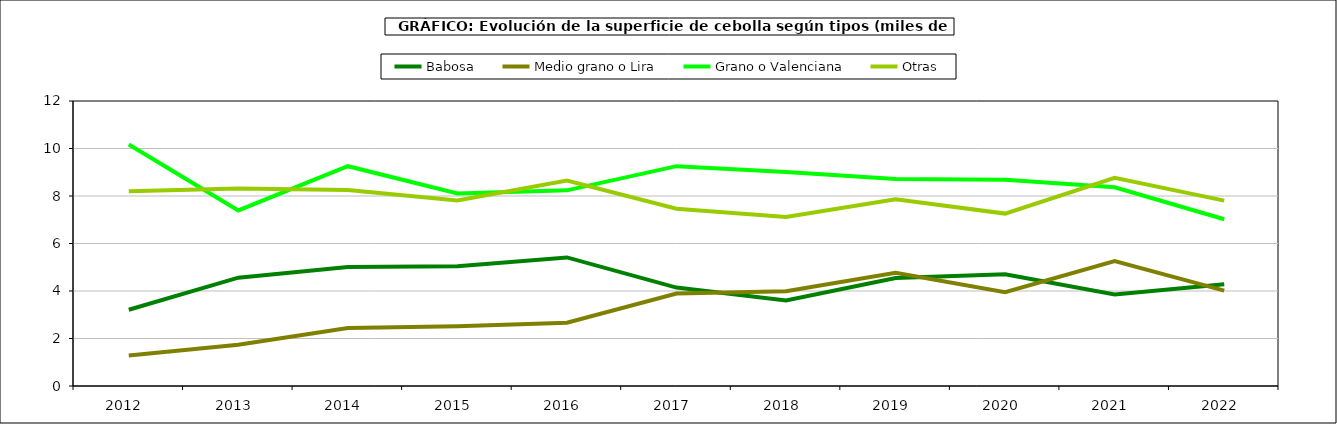
| Category | Babosa | Medio grano o Lira | Grano o Valenciana | Otras |
|---|---|---|---|---|
| 2012.0 | 3.212 | 1.284 | 10.171 | 8.2 |
| 2013.0 | 4.561 | 1.735 | 7.391 | 8.321 |
| 2014.0 | 5.014 | 2.441 | 9.254 | 8.252 |
| 2015.0 | 5.04 | 2.521 | 8.109 | 7.81 |
| 2016.0 | 5.414 | 2.662 | 8.238 | 8.655 |
| 2017.0 | 4.145 | 3.897 | 9.256 | 7.464 |
| 2018.0 | 3.6 | 3.987 | 9.012 | 7.113 |
| 2019.0 | 4.546 | 4.766 | 8.714 | 7.863 |
| 2020.0 | 4.709 | 3.952 | 8.688 | 7.259 |
| 2021.0 | 3.852 | 5.263 | 8.364 | 8.769 |
| 2022.0 | 4.282 | 4.018 | 7.021 | 7.807 |